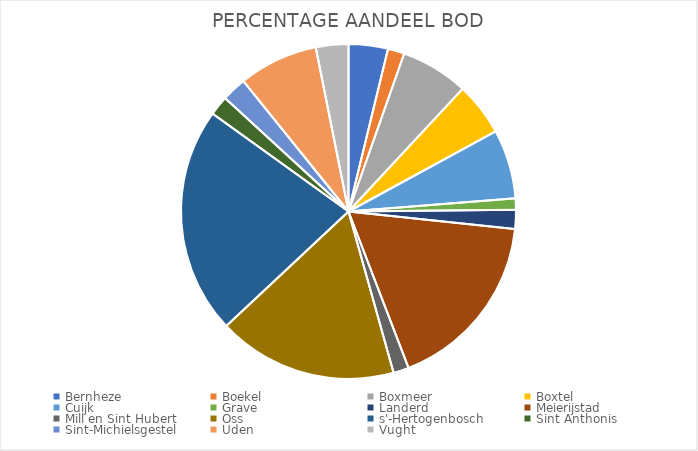
| Category | Twh | % |
|---|---|---|
| Bernheze | 0.057 | 0.038 |
| Boekel | 0.024 | 0.016 |
| Boxmeer | 0.098 | 0.065 |
| Boxtel | 0.077 | 0.051 |
| Cuijk | 0.1 | 0.067 |
| Grave | 0.016 | 0.011 |
| Landerd | 0.027 | 0.018 |
| Meierijstad | 0.262 | 0.175 |
| Mill en Sint Hubert | 0.022 | 0.015 |
| Oss | 0.26 | 0.174 |
| s'-Hertogenbosch | 0.329 | 0.219 |
| Sint Anthonis | 0.028 | 0.019 |
| Sint-Michielsgestel | 0.036 | 0.024 |
| Uden | 0.115 | 0.077 |
| Vught | 0.047 | 0.031 |